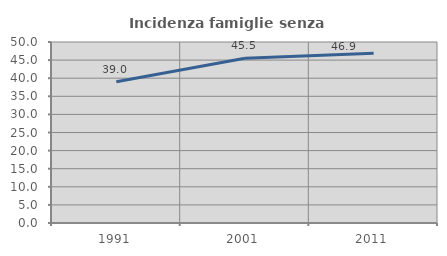
| Category | Incidenza famiglie senza nuclei |
|---|---|
| 1991.0 | 39 |
| 2001.0 | 45.495 |
| 2011.0 | 46.886 |